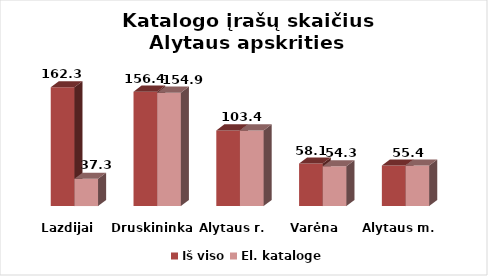
| Category | Iš viso | El. kataloge |
|---|---|---|
| Lazdijai | 162.3 | 37.3 |
| Druskininkai | 156.4 | 154.9 |
| Alytaus r. | 103.4 | 103.4 |
| Varėna | 58.1 | 54.3 |
| Alytaus m. | 55.4 | 55.4 |